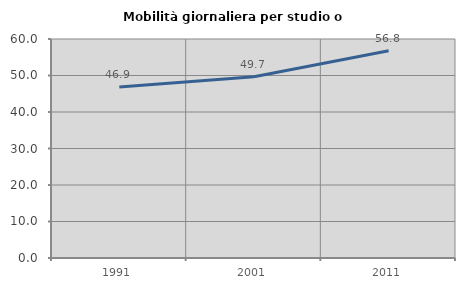
| Category | Mobilità giornaliera per studio o lavoro |
|---|---|
| 1991.0 | 46.862 |
| 2001.0 | 49.682 |
| 2011.0 | 56.789 |